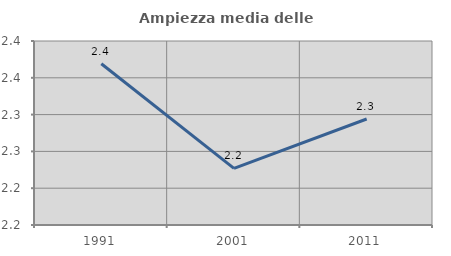
| Category | Ampiezza media delle famiglie |
|---|---|
| 1991.0 | 2.369 |
| 2001.0 | 2.227 |
| 2011.0 | 2.294 |